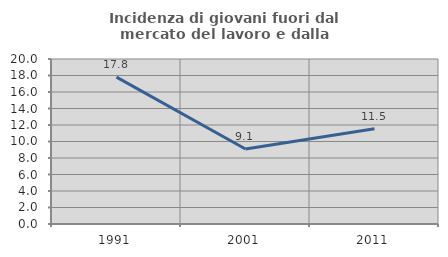
| Category | Incidenza di giovani fuori dal mercato del lavoro e dalla formazione  |
|---|---|
| 1991.0 | 17.797 |
| 2001.0 | 9.091 |
| 2011.0 | 11.538 |